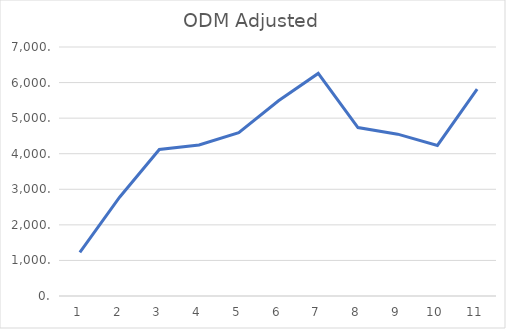
| Category | Series 0 |
|---|---|
| 0 | 1224.5 |
| 1 | 2776.2 |
| 2 | 4118.7 |
| 3 | 4245.4 |
| 4 | 4594.5 |
| 5 | 5488.2 |
| 6 | 6257.2 |
| 7 | 4736.2 |
| 8 | 4549.3 |
| 9 | 4232.7 |
| 10 | 5816 |